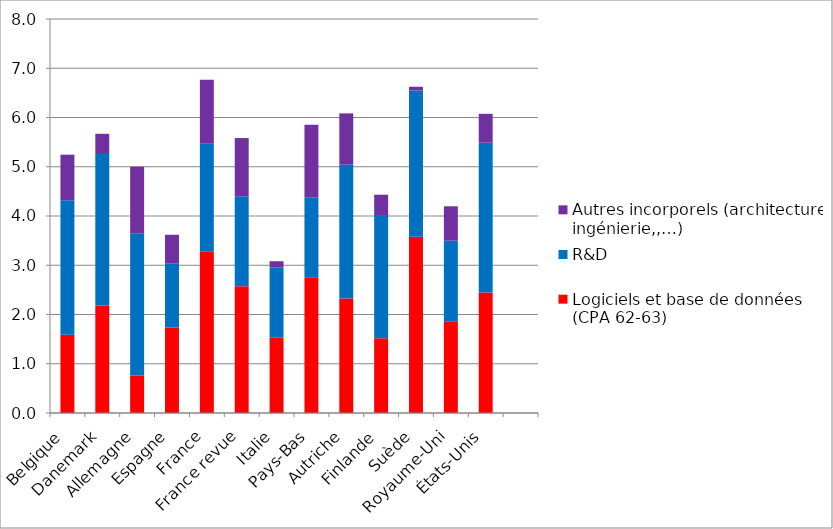
| Category | Logiciels et base de données (CPA 62-63) | R&D | Autres incorporels (architecture, ingénierie,,…) |
|---|---|---|---|
| Belgique | 1.589 | 2.731 | 0.925 |
| Danemark | 2.183 | 3.077 | 0.41 |
| Allemagne | 0.761 | 2.888 | 1.353 |
| Espagne | 1.737 | 1.294 | 0.587 |
| France | 3.275 | 2.192 | 1.3 |
| France revue | 2.576 | 1.825 | 1.182 |
| Italie | 1.526 | 1.435 | 0.121 |
| Pays-Bas | 2.755 | 1.625 | 1.471 |
| Autriche | 2.325 | 2.719 | 1.04 |
| Finlande | 1.519 | 2.501 | 0.412 |
| Suède | 3.579 | 2.97 | 0.076 |
| Royaume-Uni | 1.861 | 1.639 | 0.697 |
| États-Unis | 2.448 | 3.04 | 0.587 |